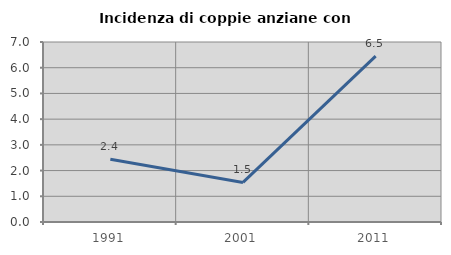
| Category | Incidenza di coppie anziane con figli |
|---|---|
| 1991.0 | 2.439 |
| 2001.0 | 1.538 |
| 2011.0 | 6.452 |